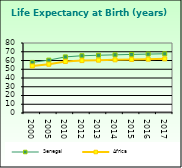
| Category | Senegal | Africa                        |
|---|---|---|
| 2000.0 | 57.809 | 53.721 |
| 2005.0 | 60.432 | 55.757 |
| 2010.0 | 64.113 | 58.857 |
| 2012.0 | 65.429 | 59.91 |
| 2013.0 | 65.994 | 60.376 |
| 2014.0 | 66.493 | 60.801 |
| 2015.0 | 66.929 | 61.187 |
| 2016.0 | 67.314 | 61.538 |
| 2017.0 | 67.669 | 61.865 |